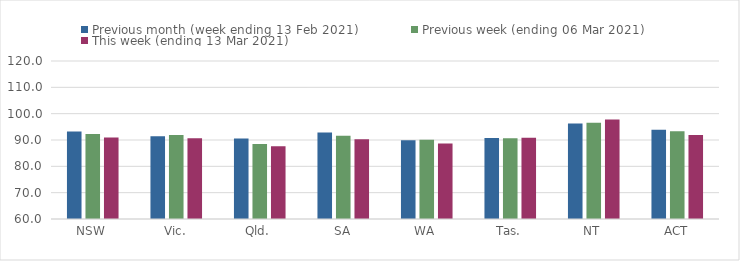
| Category | Previous month (week ending 13 Feb 2021) | Previous week (ending 06 Mar 2021) | This week (ending 13 Mar 2021) |
|---|---|---|---|
| NSW | 93.21 | 92.29 | 90.99 |
| Vic. | 91.47 | 91.86 | 90.65 |
| Qld. | 90.57 | 88.44 | 87.61 |
| SA | 92.89 | 91.58 | 90.27 |
| WA | 89.95 | 90.12 | 88.7 |
| Tas. | 90.74 | 90.64 | 90.83 |
| NT | 96.27 | 96.58 | 97.83 |
| ACT | 93.87 | 93.29 | 91.88 |